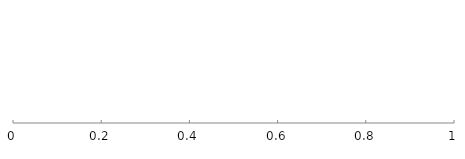
| Category | Carbon dioxide | Copper sulfate | Diatomaceous earth | Dimethyl dicarbonate | Sodium carbonate peroxohydrate (or similar basic cleaning agents, i.e. Sodium Metasilicate [Metso-20]) | Sodium hydroxide | Sulfur dioxide | Potassium (or sodium) metabisulfite |
|---|---|---|---|---|---|---|---|---|
| 0 | 0 | 0 | 0 | 0 | 0 | 0 | 0 | 0 |